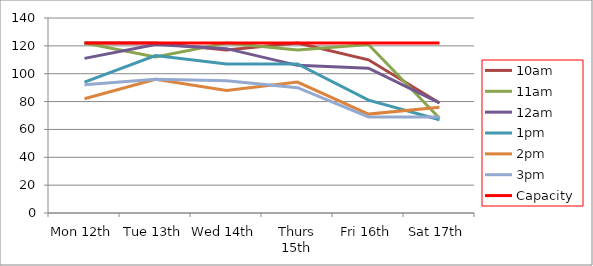
| Category | 9am | 10am | 11am | 12am | 1pm | 2pm | 3pm | 4pm | 5pm | Capacity |
|---|---|---|---|---|---|---|---|---|---|---|
| Mon 12th |  | 122 | 122 | 111 | 94 | 82 | 92 |  |  | 122 |
| Tue 13th |  | 122 | 112 | 121 | 113 | 96 | 96 |  |  | 122 |
| Wed 14th |  | 117 | 122 | 118 | 107 | 88 | 95 |  |  | 122 |
| Thurs 15th |  | 122 | 117 | 106 | 107 | 94 | 90 |  |  | 122 |
| Fri 16th |  | 110 | 121 | 104 | 81 | 71 | 69 |  |  | 122 |
| Sat 17th |  | 79 | 68 | 79 | 67 | 76 | 69 |  |  | 122 |